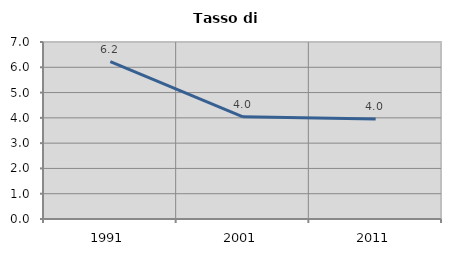
| Category | Tasso di disoccupazione   |
|---|---|
| 1991.0 | 6.225 |
| 2001.0 | 4.04 |
| 2011.0 | 3.95 |